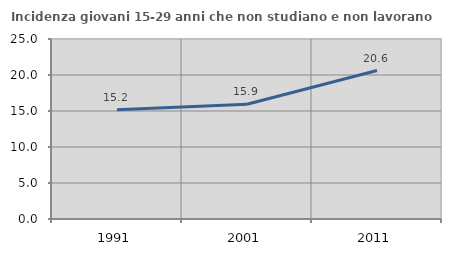
| Category | Incidenza giovani 15-29 anni che non studiano e non lavorano  |
|---|---|
| 1991.0 | 15.176 |
| 2001.0 | 15.939 |
| 2011.0 | 20.622 |